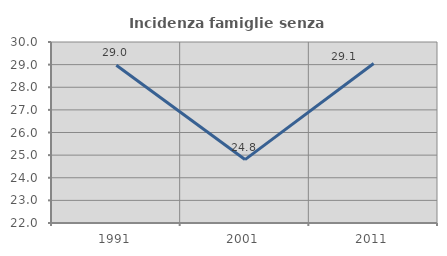
| Category | Incidenza famiglie senza nuclei |
|---|---|
| 1991.0 | 28.97 |
| 2001.0 | 24.803 |
| 2011.0 | 29.051 |